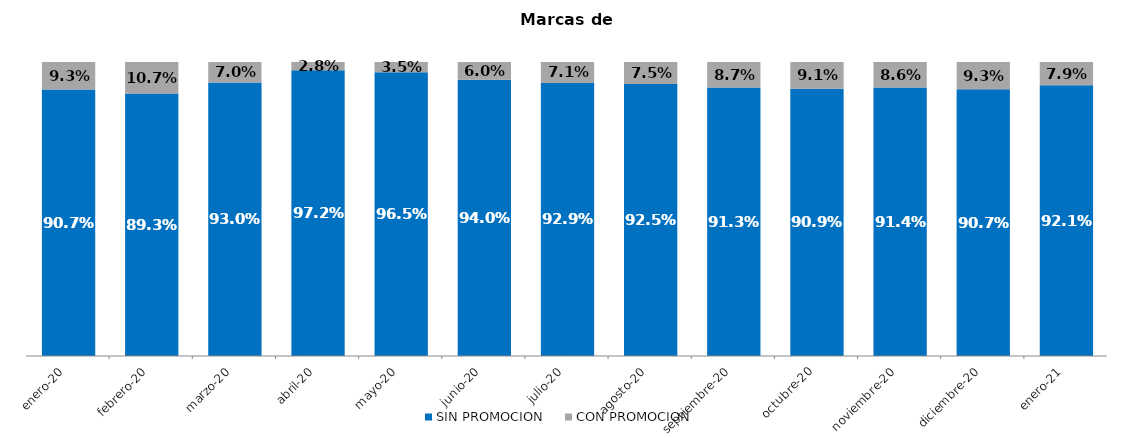
| Category | SIN PROMOCION   | CON PROMOCION   |
|---|---|---|
| 2020-01-01 | 0.907 | 0.093 |
| 2020-02-01 | 0.893 | 0.107 |
| 2020-03-01 | 0.93 | 0.07 |
| 2020-04-01 | 0.972 | 0.028 |
| 2020-05-01 | 0.965 | 0.035 |
| 2020-06-01 | 0.94 | 0.06 |
| 2020-07-01 | 0.929 | 0.071 |
| 2020-08-01 | 0.925 | 0.075 |
| 2020-09-01 | 0.913 | 0.087 |
| 2020-10-01 | 0.909 | 0.091 |
| 2020-11-01 | 0.914 | 0.086 |
| 2020-12-01 | 0.907 | 0.093 |
| 2021-01-01 | 0.921 | 0.079 |